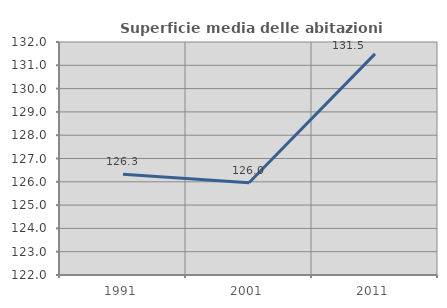
| Category | Superficie media delle abitazioni occupate |
|---|---|
| 1991.0 | 126.319 |
| 2001.0 | 125.962 |
| 2011.0 | 131.491 |